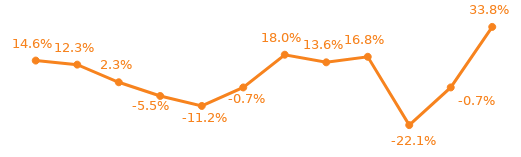
| Category | Series 0 |
|---|---|
| 0 | 0.146 |
| 1 | 0.123 |
| 2 | 0.023 |
| 3 | -0.055 |
| 4 | -0.112 |
| 5 | -0.007 |
| 6 | 0.18 |
| 7 | 0.136 |
| 8 | 0.168 |
| 9 | -0.221 |
| 10 | -0.007 |
| 11 | 0.338 |